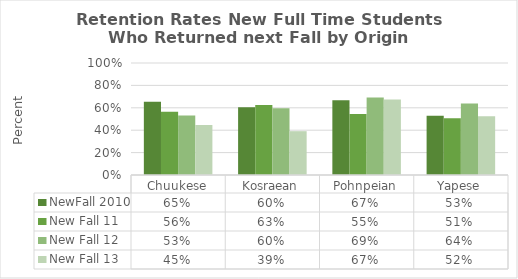
| Category | NewFall 2010 | New Fall 11 | New Fall 12 | New Fall 13 |
|---|---|---|---|---|
| Chuukese | 0.654 | 0.564 | 0.531 | 0.446 |
| Kosraean | 0.605 | 0.625 | 0.595 | 0.391 |
| Pohnpeian | 0.668 | 0.545 | 0.691 | 0.674 |
| Yapese | 0.528 | 0.507 | 0.639 | 0.524 |